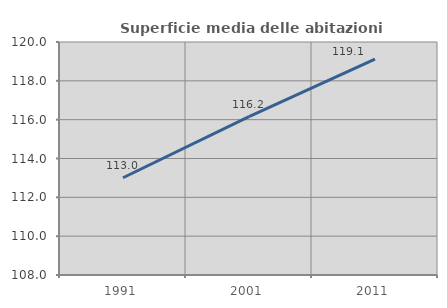
| Category | Superficie media delle abitazioni occupate |
|---|---|
| 1991.0 | 113.009 |
| 2001.0 | 116.162 |
| 2011.0 | 119.121 |